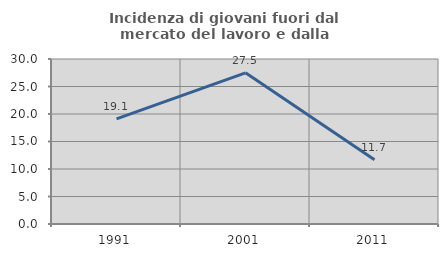
| Category | Incidenza di giovani fuori dal mercato del lavoro e dalla formazione  |
|---|---|
| 1991.0 | 19.113 |
| 2001.0 | 27.49 |
| 2011.0 | 11.682 |